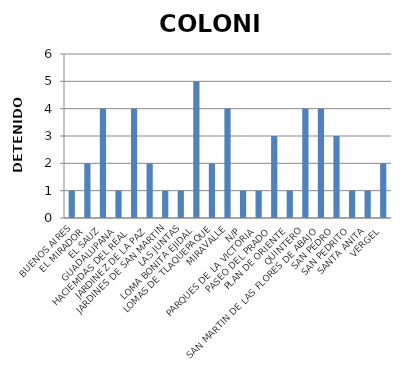
| Category | COLONIA |
|---|---|
| BUENOS AIRES | 1 |
| EL MIRADOR | 2 |
| EL SAUZ | 4 |
| GUADALUPANA  | 1 |
| HACIEMDAS DEL REAL  | 4 |
| JARDINEZ DE LA PAZ | 2 |
| JARDINES DE SAN MARTIN | 1 |
| LAS JUNTAS | 1 |
| LOMA BONITA EJIDAL | 5 |
| LOMAS DE TLAQUEPAQUE | 2 |
| MIRAVALLE | 4 |
| N/P | 1 |
| PARQUES DE LA VICTORIA | 1 |
| PASEO DEL PRADO | 3 |
| PLAN DE ORIENTE | 1 |
| QUINTERO | 4 |
| SAN MARTIN DE LAS FLORES DE ABAJO | 4 |
| SAN PEDRO | 3 |
| SAN PEDRITO | 1 |
| SANTA ANITA | 1 |
| VERGEL  | 2 |